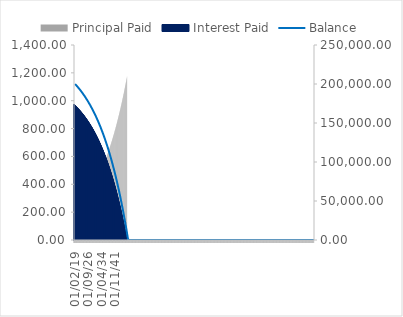
| Category | Principal Paid | Interest Paid |
|---|---|---|
| 01/02/19 | 205.231 | 973.51 |
| 01/03/19 | 206.23 | 972.511 |
| 01/04/19 | 207.234 | 971.507 |
| 01/05/19 | 208.242 | 970.499 |
| 01/06/19 | 209.256 | 969.485 |
| 01/07/19 | 210.274 | 968.466 |
| 01/08/19 | 211.298 | 967.443 |
| 01/09/19 | 212.326 | 966.414 |
| 01/10/19 | 213.36 | 965.381 |
| 01/11/19 | 214.399 | 964.342 |
| 01/12/19 | 215.442 | 963.299 |
| 01/01/20 | 216.491 | 962.25 |
| 01/02/20 | 217.545 | 961.196 |
| 01/03/20 | 218.603 | 960.137 |
| 01/04/20 | 219.668 | 959.073 |
| 01/05/20 | 220.737 | 958.004 |
| 01/06/20 | 221.811 | 956.93 |
| 01/07/20 | 222.891 | 955.85 |
| 01/08/20 | 223.976 | 954.765 |
| 01/09/20 | 225.066 | 953.675 |
| 01/10/20 | 226.162 | 952.579 |
| 01/11/20 | 227.262 | 951.478 |
| 01/12/20 | 228.369 | 950.372 |
| 01/01/21 | 229.48 | 949.261 |
| 01/02/21 | 230.597 | 948.144 |
| 01/03/21 | 231.72 | 947.021 |
| 01/04/21 | 232.848 | 945.893 |
| 01/05/21 | 233.981 | 944.76 |
| 01/06/21 | 235.12 | 943.621 |
| 01/07/21 | 236.264 | 942.476 |
| 01/08/21 | 237.414 | 941.326 |
| 01/09/21 | 238.57 | 940.171 |
| 01/10/21 | 239.731 | 939.01 |
| 01/11/21 | 240.898 | 937.843 |
| 01/12/21 | 242.071 | 936.67 |
| 01/01/22 | 243.249 | 935.492 |
| 01/02/22 | 244.433 | 934.308 |
| 01/03/22 | 245.623 | 933.118 |
| 01/04/22 | 246.818 | 931.922 |
| 01/05/22 | 248.02 | 930.721 |
| 01/06/22 | 249.227 | 929.514 |
| 01/07/22 | 250.44 | 928.301 |
| 01/08/22 | 251.659 | 927.082 |
| 01/09/22 | 252.884 | 925.857 |
| 01/10/22 | 254.115 | 924.626 |
| 01/11/22 | 255.352 | 923.389 |
| 01/12/22 | 256.595 | 922.146 |
| 01/01/23 | 257.844 | 920.897 |
| 01/02/23 | 259.099 | 919.642 |
| 01/03/23 | 260.36 | 918.381 |
| 01/04/23 | 261.628 | 917.113 |
| 01/05/23 | 262.901 | 915.84 |
| 01/06/23 | 264.181 | 914.56 |
| 01/07/23 | 265.467 | 913.274 |
| 01/08/23 | 266.759 | 911.982 |
| 01/09/23 | 268.057 | 910.684 |
| 01/10/23 | 269.362 | 909.379 |
| 01/11/23 | 270.673 | 908.068 |
| 01/12/23 | 271.991 | 906.75 |
| 01/01/24 | 273.315 | 905.426 |
| 01/02/24 | 274.645 | 904.096 |
| 01/03/24 | 275.982 | 902.759 |
| 01/04/24 | 277.325 | 901.416 |
| 01/05/24 | 278.675 | 900.066 |
| 01/06/24 | 280.032 | 898.709 |
| 01/07/24 | 281.395 | 897.346 |
| 01/08/24 | 282.764 | 895.976 |
| 01/09/24 | 284.141 | 894.6 |
| 01/10/24 | 285.524 | 893.217 |
| 01/11/24 | 286.914 | 891.827 |
| 01/12/24 | 288.31 | 890.431 |
| 01/01/25 | 289.714 | 889.027 |
| 01/02/25 | 291.124 | 887.617 |
| 01/03/25 | 292.541 | 886.2 |
| 01/04/25 | 293.965 | 884.776 |
| 01/05/25 | 295.396 | 883.345 |
| 01/06/25 | 296.833 | 881.907 |
| 01/07/25 | 298.278 | 880.463 |
| 01/08/25 | 299.73 | 879.011 |
| 01/09/25 | 301.189 | 877.552 |
| 01/10/25 | 302.655 | 876.086 |
| 01/11/25 | 304.128 | 874.612 |
| 01/12/25 | 305.609 | 873.132 |
| 01/01/26 | 307.096 | 871.645 |
| 01/02/26 | 308.591 | 870.15 |
| 01/03/26 | 310.093 | 868.648 |
| 01/04/26 | 311.603 | 867.138 |
| 01/05/26 | 313.119 | 865.621 |
| 01/06/26 | 314.643 | 864.097 |
| 01/07/26 | 316.175 | 862.566 |
| 01/08/26 | 317.714 | 861.027 |
| 01/09/26 | 319.26 | 859.48 |
| 01/10/26 | 320.815 | 857.926 |
| 01/11/26 | 322.376 | 856.365 |
| 01/12/26 | 323.945 | 854.796 |
| 01/01/27 | 325.522 | 853.219 |
| 01/02/27 | 327.107 | 851.634 |
| 01/03/27 | 328.699 | 850.042 |
| 01/04/27 | 330.299 | 848.442 |
| 01/05/27 | 331.907 | 846.834 |
| 01/06/27 | 333.522 | 845.219 |
| 01/07/27 | 335.146 | 843.595 |
| 01/08/27 | 336.777 | 841.964 |
| 01/09/27 | 338.416 | 840.325 |
| 01/10/27 | 340.063 | 838.677 |
| 01/11/27 | 341.719 | 837.022 |
| 01/12/27 | 343.382 | 835.359 |
| 01/01/28 | 345.053 | 833.687 |
| 01/02/28 | 346.733 | 832.008 |
| 01/03/28 | 348.421 | 830.32 |
| 01/04/28 | 350.117 | 828.624 |
| 01/05/28 | 351.821 | 826.92 |
| 01/06/28 | 353.533 | 825.207 |
| 01/07/28 | 355.254 | 823.487 |
| 01/08/28 | 356.983 | 821.757 |
| 01/09/28 | 358.721 | 820.02 |
| 01/10/28 | 360.467 | 818.274 |
| 01/11/28 | 362.222 | 816.519 |
| 01/12/28 | 363.985 | 814.756 |
| 01/01/29 | 365.757 | 812.984 |
| 01/02/29 | 367.537 | 811.204 |
| 01/03/29 | 369.326 | 809.415 |
| 01/04/29 | 371.124 | 807.617 |
| 01/05/29 | 372.93 | 805.811 |
| 01/06/29 | 374.745 | 803.995 |
| 01/07/29 | 376.569 | 802.171 |
| 01/08/29 | 378.402 | 800.338 |
| 01/09/29 | 380.244 | 798.496 |
| 01/10/29 | 382.095 | 796.646 |
| 01/11/29 | 383.955 | 794.786 |
| 01/12/29 | 385.824 | 792.917 |
| 01/01/30 | 387.702 | 791.039 |
| 01/02/30 | 389.589 | 789.152 |
| 01/03/30 | 391.486 | 787.255 |
| 01/04/30 | 393.391 | 785.35 |
| 01/05/30 | 395.306 | 783.435 |
| 01/06/30 | 397.23 | 781.511 |
| 01/07/30 | 399.164 | 779.577 |
| 01/08/30 | 401.107 | 777.634 |
| 01/09/30 | 403.059 | 775.682 |
| 01/10/30 | 405.021 | 773.72 |
| 01/11/30 | 406.992 | 771.748 |
| 01/12/30 | 408.973 | 769.767 |
| 01/01/31 | 410.964 | 767.777 |
| 01/02/31 | 412.965 | 765.776 |
| 01/03/31 | 414.975 | 763.766 |
| 01/04/31 | 416.995 | 761.746 |
| 01/05/31 | 419.024 | 759.717 |
| 01/06/31 | 421.064 | 757.677 |
| 01/07/31 | 423.113 | 755.627 |
| 01/08/31 | 425.173 | 753.568 |
| 01/09/31 | 427.243 | 751.498 |
| 01/10/31 | 429.322 | 749.419 |
| 01/11/31 | 431.412 | 747.329 |
| 01/12/31 | 433.512 | 745.229 |
| 01/01/32 | 435.622 | 743.119 |
| 01/02/32 | 437.742 | 740.998 |
| 01/03/32 | 439.873 | 738.868 |
| 01/04/32 | 442.014 | 736.727 |
| 01/05/32 | 444.166 | 734.575 |
| 01/06/32 | 446.328 | 732.413 |
| 01/07/32 | 448.5 | 730.241 |
| 01/08/32 | 450.683 | 728.057 |
| 01/09/32 | 452.877 | 725.864 |
| 01/10/32 | 455.082 | 723.659 |
| 01/11/32 | 457.297 | 721.444 |
| 01/12/32 | 459.523 | 719.218 |
| 01/01/33 | 461.759 | 716.982 |
| 01/02/33 | 464.007 | 714.734 |
| 01/03/33 | 466.266 | 712.475 |
| 01/04/33 | 468.535 | 710.206 |
| 01/05/33 | 470.816 | 707.925 |
| 01/06/33 | 473.107 | 705.633 |
| 01/07/33 | 475.41 | 703.331 |
| 01/08/33 | 477.724 | 701.016 |
| 01/09/33 | 480.05 | 698.691 |
| 01/10/33 | 482.386 | 696.354 |
| 01/11/33 | 484.734 | 694.006 |
| 01/12/33 | 487.094 | 691.647 |
| 01/01/34 | 489.465 | 689.276 |
| 01/02/34 | 491.847 | 686.893 |
| 01/03/34 | 494.241 | 684.499 |
| 01/04/34 | 496.647 | 682.094 |
| 01/05/34 | 499.065 | 679.676 |
| 01/06/34 | 501.494 | 677.247 |
| 01/07/34 | 503.935 | 674.806 |
| 01/08/34 | 506.388 | 672.353 |
| 01/09/34 | 508.853 | 669.888 |
| 01/10/34 | 511.33 | 667.411 |
| 01/11/34 | 513.819 | 664.922 |
| 01/12/34 | 516.32 | 662.421 |
| 01/01/35 | 518.833 | 659.908 |
| 01/02/35 | 521.358 | 657.383 |
| 01/03/35 | 523.896 | 654.845 |
| 01/04/35 | 526.446 | 652.295 |
| 01/05/35 | 529.009 | 649.732 |
| 01/06/35 | 531.584 | 647.157 |
| 01/07/35 | 534.171 | 644.57 |
| 01/08/35 | 536.771 | 641.97 |
| 01/09/35 | 539.384 | 639.357 |
| 01/10/35 | 542.009 | 636.731 |
| 01/11/35 | 544.648 | 634.093 |
| 01/12/35 | 547.299 | 631.442 |
| 01/01/36 | 549.963 | 628.778 |
| 01/02/36 | 552.64 | 626.101 |
| 01/03/36 | 555.33 | 623.411 |
| 01/04/36 | 558.033 | 620.708 |
| 01/05/36 | 560.749 | 617.992 |
| 01/06/36 | 563.479 | 615.262 |
| 01/07/36 | 566.221 | 612.52 |
| 01/08/36 | 568.977 | 609.763 |
| 01/09/36 | 571.747 | 606.994 |
| 01/10/36 | 574.53 | 604.211 |
| 01/11/36 | 577.326 | 601.414 |
| 01/12/36 | 580.137 | 598.604 |
| 01/01/37 | 582.96 | 595.78 |
| 01/02/37 | 585.798 | 592.943 |
| 01/03/37 | 588.649 | 590.091 |
| 01/04/37 | 591.515 | 587.226 |
| 01/05/37 | 594.394 | 584.347 |
| 01/06/37 | 597.287 | 581.454 |
| 01/07/37 | 600.195 | 578.546 |
| 01/08/37 | 603.116 | 575.625 |
| 01/09/37 | 606.052 | 572.689 |
| 01/10/37 | 609.002 | 569.739 |
| 01/11/37 | 611.966 | 566.775 |
| 01/12/37 | 614.945 | 563.796 |
| 01/01/38 | 617.938 | 560.803 |
| 01/02/38 | 620.946 | 557.795 |
| 01/03/38 | 623.968 | 554.772 |
| 01/04/38 | 627.006 | 551.735 |
| 01/05/38 | 630.058 | 548.683 |
| 01/06/38 | 633.124 | 545.616 |
| 01/07/38 | 636.206 | 542.535 |
| 01/08/38 | 639.303 | 539.438 |
| 01/09/38 | 642.415 | 536.326 |
| 01/10/38 | 645.542 | 533.199 |
| 01/11/38 | 648.684 | 530.057 |
| 01/12/38 | 651.842 | 526.899 |
| 01/01/39 | 655.014 | 523.726 |
| 01/02/39 | 658.203 | 520.538 |
| 01/03/39 | 661.407 | 517.334 |
| 01/04/39 | 664.626 | 514.115 |
| 01/05/39 | 667.861 | 510.88 |
| 01/06/39 | 671.112 | 507.629 |
| 01/07/39 | 674.379 | 504.362 |
| 01/08/39 | 677.661 | 501.08 |
| 01/09/39 | 680.96 | 497.781 |
| 01/10/39 | 684.274 | 494.466 |
| 01/11/39 | 687.605 | 491.136 |
| 01/12/39 | 690.952 | 487.789 |
| 01/01/40 | 694.315 | 484.426 |
| 01/02/40 | 697.695 | 481.046 |
| 01/03/40 | 701.091 | 477.65 |
| 01/04/40 | 704.504 | 474.237 |
| 01/05/40 | 707.933 | 470.808 |
| 01/06/40 | 711.379 | 467.362 |
| 01/07/40 | 714.841 | 463.9 |
| 01/08/40 | 718.321 | 460.42 |
| 01/09/40 | 721.817 | 456.924 |
| 01/10/40 | 725.331 | 453.41 |
| 01/11/40 | 728.861 | 449.879 |
| 01/12/40 | 732.409 | 446.332 |
| 01/01/41 | 735.974 | 442.767 |
| 01/02/41 | 739.557 | 439.184 |
| 01/03/41 | 743.156 | 435.584 |
| 01/04/41 | 746.774 | 431.967 |
| 01/05/41 | 750.409 | 428.332 |
| 01/06/41 | 754.061 | 424.679 |
| 01/07/41 | 757.732 | 421.009 |
| 01/08/41 | 761.42 | 417.321 |
| 01/09/41 | 765.126 | 413.614 |
| 01/10/41 | 768.851 | 409.89 |
| 01/11/41 | 772.593 | 406.148 |
| 01/12/41 | 776.354 | 402.387 |
| 01/01/42 | 780.133 | 398.608 |
| 01/02/42 | 783.93 | 394.811 |
| 01/03/42 | 787.746 | 390.995 |
| 01/04/42 | 791.58 | 387.161 |
| 01/05/42 | 795.433 | 383.308 |
| 01/06/42 | 799.305 | 379.436 |
| 01/07/42 | 803.196 | 375.545 |
| 01/08/42 | 807.105 | 371.636 |
| 01/09/42 | 811.034 | 367.707 |
| 01/10/42 | 814.982 | 363.759 |
| 01/11/42 | 818.949 | 359.792 |
| 01/12/42 | 822.935 | 355.806 |
| 01/01/43 | 826.941 | 351.8 |
| 01/02/43 | 830.966 | 347.775 |
| 01/03/43 | 835.011 | 343.73 |
| 01/04/43 | 839.075 | 339.666 |
| 01/05/43 | 843.159 | 335.582 |
| 01/06/43 | 847.263 | 331.477 |
| 01/07/43 | 851.387 | 327.353 |
| 01/08/43 | 855.532 | 323.209 |
| 01/09/43 | 859.696 | 319.045 |
| 01/10/43 | 863.881 | 314.86 |
| 01/11/43 | 868.086 | 310.655 |
| 01/12/43 | 872.311 | 306.43 |
| 01/01/44 | 876.557 | 302.184 |
| 01/02/44 | 880.824 | 297.917 |
| 01/03/44 | 885.111 | 293.63 |
| 01/04/44 | 889.419 | 289.321 |
| 01/05/44 | 893.749 | 284.992 |
| 01/06/44 | 898.099 | 280.642 |
| 01/07/44 | 902.471 | 276.27 |
| 01/08/44 | 906.864 | 271.877 |
| 01/09/44 | 911.278 | 267.463 |
| 01/10/44 | 915.713 | 263.027 |
| 01/11/44 | 920.171 | 258.57 |
| 01/12/44 | 924.65 | 254.091 |
| 01/01/45 | 929.15 | 249.59 |
| 01/02/45 | 933.673 | 245.068 |
| 01/03/45 | 938.218 | 240.523 |
| 01/04/45 | 942.785 | 235.956 |
| 01/05/45 | 947.374 | 231.367 |
| 01/06/45 | 951.985 | 226.756 |
| 01/07/45 | 956.619 | 222.122 |
| 01/08/45 | 961.275 | 217.465 |
| 01/09/45 | 965.954 | 212.786 |
| 01/10/45 | 970.656 | 208.085 |
| 01/11/45 | 975.381 | 203.36 |
| 01/12/45 | 980.129 | 198.612 |
| 01/01/46 | 984.899 | 193.841 |
| 01/02/46 | 989.694 | 189.047 |
| 01/03/46 | 994.511 | 184.23 |
| 01/04/46 | 999.352 | 179.389 |
| 01/05/46 | 1004.216 | 174.525 |
| 01/06/46 | 1009.104 | 169.637 |
| 01/07/46 | 1014.016 | 164.725 |
| 01/08/46 | 1018.952 | 159.789 |
| 01/09/46 | 1023.912 | 154.829 |
| 01/10/46 | 1028.896 | 149.845 |
| 01/11/46 | 1033.904 | 144.837 |
| 01/12/46 | 1038.936 | 139.804 |
| 01/01/47 | 1043.993 | 134.747 |
| 01/02/47 | 1049.075 | 129.666 |
| 01/03/47 | 1054.182 | 124.559 |
| 01/04/47 | 1059.313 | 119.428 |
| 01/05/47 | 1064.469 | 114.272 |
| 01/06/47 | 1069.65 | 109.09 |
| 01/07/47 | 1074.857 | 103.884 |
| 01/08/47 | 1080.089 | 98.652 |
| 01/09/47 | 1085.346 | 93.394 |
| 01/10/47 | 1090.629 | 88.111 |
| 01/11/47 | 1095.938 | 82.803 |
| 01/12/47 | 1101.273 | 77.468 |
| 01/01/48 | 1106.633 | 72.108 |
| 01/02/48 | 1112.02 | 66.721 |
| 01/03/48 | 1117.432 | 61.308 |
| 01/04/48 | 1122.872 | 55.869 |
| 01/05/48 | 1128.337 | 50.404 |
| 01/06/48 | 1133.829 | 44.911 |
| 01/07/48 | 1139.348 | 39.392 |
| 01/08/48 | 1144.894 | 33.847 |
| 01/09/48 | 1150.467 | 28.274 |
| 01/10/48 | 1156.067 | 22.674 |
| 01/11/48 | 1161.694 | 17.047 |
| 01/12/48 | 1167.349 | 11.392 |
| 01/01/49 | 1173.031 | 5.71 |